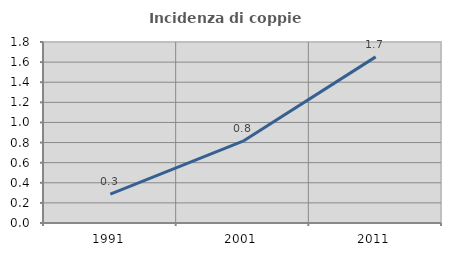
| Category | Incidenza di coppie miste |
|---|---|
| 1991.0 | 0.287 |
| 2001.0 | 0.814 |
| 2011.0 | 1.652 |